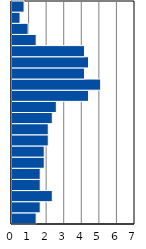
| Category | Series 0 |
|---|---|
| 0-4 | 1.376 |
| 5-9 | 1.606 |
| 10-14 | 2.294 |
| 15-19 | 1.606 |
| 20-24 | 1.606 |
| 25-29 | 1.835 |
| 30-34 | 1.835 |
| 35-39 | 2.064 |
| 40-44 | 2.064 |
| 45-49 | 2.294 |
| 50-54 | 2.523 |
| 55-59 | 4.358 |
| 60-64 | 5.046 |
| 65-69 | 4.128 |
| 70-74 | 4.358 |
| 75-79 | 4.128 |
| 80-84 | 1.376 |
| 85-89 | 0.917 |
| 90-94 | 0.459 |
| 95+ | 0.688 |